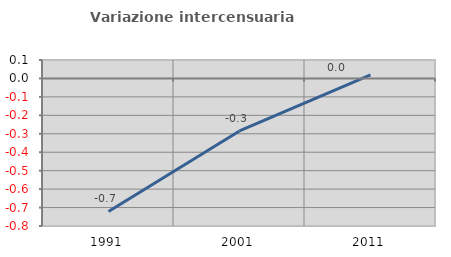
| Category | Variazione intercensuaria annua |
|---|---|
| 1991.0 | -0.721 |
| 2001.0 | -0.285 |
| 2011.0 | 0.02 |